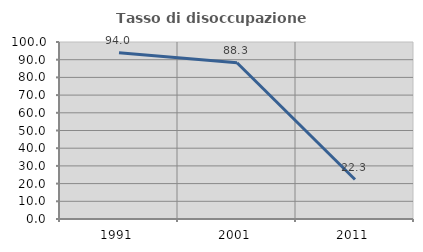
| Category | Tasso di disoccupazione giovanile  |
|---|---|
| 1991.0 | 93.958 |
| 2001.0 | 88.304 |
| 2011.0 | 22.289 |